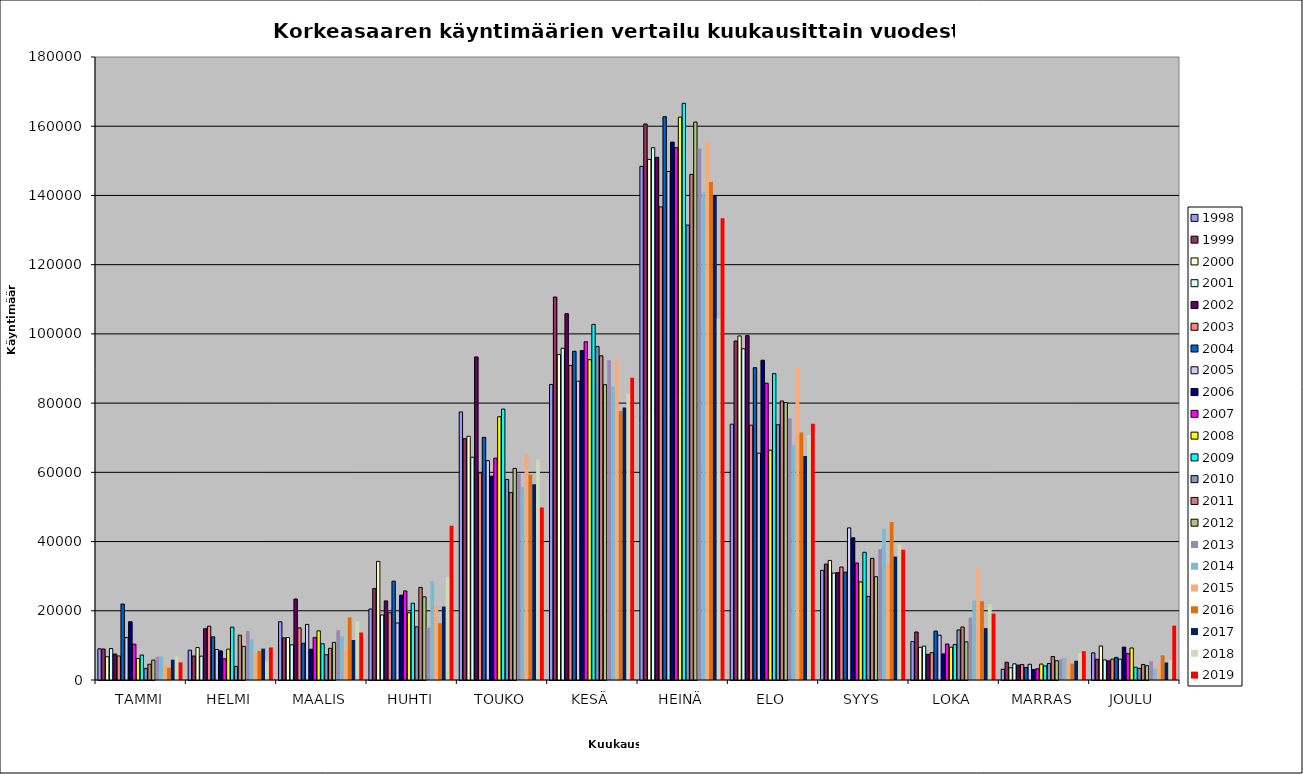
| Category | 1998 | 1999 | 2000 | 2001 | 2002 | 2003 | 2004 | 2005 | 2006 | 2007 | 2008 | 2009 | 2010 | 2011 | 2012 | 2013 | 2014 | 2015 | 2016 | 2017 | 2018 | 2019 |
|---|---|---|---|---|---|---|---|---|---|---|---|---|---|---|---|---|---|---|---|---|---|---|
| TAMMI | 9003 | 8949 | 6721 | 9085 | 7513 | 6938 | 21941 | 12240 | 16829 | 10354 | 6207 | 7204 | 3344 | 4556 | 5742 | 6730 | 6803 | 4556 | 3553 | 5871 | 6731 | 5088 |
| HELMI | 8616 | 6929 | 9374 | 6889 | 14809 | 15538 | 12473 | 8806 | 8403 | 6124 | 8913 | 15264 | 3926 | 12940 | 9712 | 14162 | 11731 | 7718 | 8420 | 9065 | 5400 | 9398 |
| MAALIS | 16822 | 12178 | 12271 | 10154 | 23403 | 15061 | 10599 | 16063 | 8894 | 12301 | 14193 | 10485 | 7285 | 9159 | 10876 | 14378 | 12628 | 8744 | 18108 | 11558 | 16983 | 13710 |
| HUHTI | 20503 | 26415 | 34262 | 18785 | 22841 | 19435 | 28549 | 16469 | 24514 | 25732 | 19422 | 22177 | 15354 | 26760 | 24039 | 15113 | 28569 | 21260 | 16429 | 21218 | 29770 | 44534 |
| TOUKO | 77447 | 69728 | 70416 | 64361 | 93342 | 59874 | 70105 | 63378 | 58885 | 64080 | 76060 | 78270 | 57940 | 54150 | 61128 | 59619 | 55728 | 65517 | 59352 | 56562 | 63742 | 49864 |
| KESÄ | 85396 | 110647 | 94011 | 95856 | 105846 | 90873 | 94967 | 86333 | 95209 | 97709 | 92546 | 102745 | 96356 | 93655 | 85315 | 92408 | 84776 | 92488 | 77746 | 78738 | 82610 | 87301 |
| HEINÄ | 148381 | 160652 | 150414 | 153801 | 151023 | 136697 | 162767 | 146930 | 155408 | 153796 | 162622 | 166623 | 131430 | 146090 | 161200 | 153545 | 140821 | 155375 | 143900 | 139867 | 104478 | 133418 |
| ELO | 73915 | 97951 | 99397 | 95712 | 99497 | 73619 | 90242 | 65538 | 92396 | 85757 | 66395 | 88526 | 73749 | 80605 | 80163 | 75614 | 67993 | 90282 | 71532 | 64730 | 70815 | 74073 |
| SYYS | 31680 | 33482 | 34547 | 30910 | 31054 | 32636 | 31149 | 43946 | 41081 | 33799 | 28340 | 36910 | 24154 | 35137 | 29849 | 37836 | 43684 | 33817 | 45679 | 35657 | 39128 | 37650 |
| LOKA | 11086 | 13869 | 9457 | 9780 | 7402 | 7887 | 14139 | 12949 | 7539 | 10396 | 9481 | 10251 | 14470 | 15304 | 11024 | 18035 | 22963 | 32558 | 22781 | 15004 | 21923 | 19209 |
| MARRAS | 3104 | 5119 | 3525 | 4671 | 4310 | 4462 | 3621 | 4548 | 3007 | 3247 | 4602 | 4067 | 4767 | 6776 | 5566 | 6054 | 6427 | 5969 | 4749 | 5566 | 7739 | 8319 |
| JOULU | 7849 | 5980 | 9818 | 5796 | 5534 | 6039 | 6535 | 6002 | 9506 | 7668 | 9250 | 3679 | 3360 | 4489 | 4123 | 5467 | 3277 | 4634 | 7145 | 5046 | 5764 | 15702 |